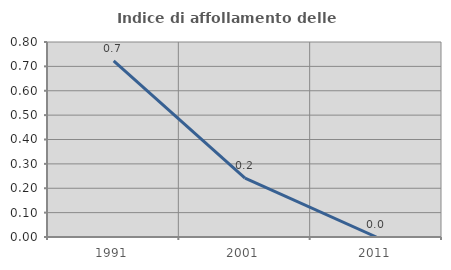
| Category | Indice di affollamento delle abitazioni  |
|---|---|
| 1991.0 | 0.723 |
| 2001.0 | 0.242 |
| 2011.0 | 0 |